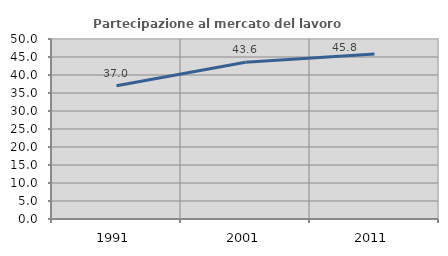
| Category | Partecipazione al mercato del lavoro  femminile |
|---|---|
| 1991.0 | 37.03 |
| 2001.0 | 43.567 |
| 2011.0 | 45.821 |